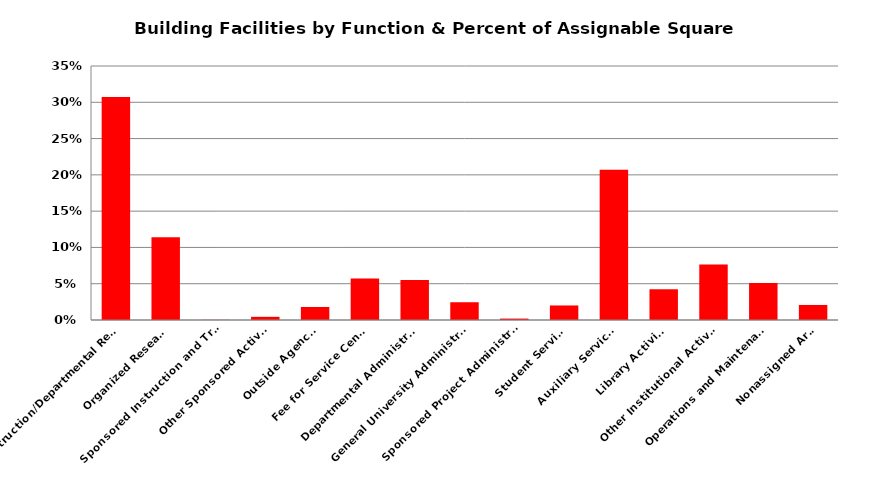
| Category | Percent |
|---|---|
| Instruction/Departmental Research | 0.307 |
| Organized Research | 0.114 |
| Sponsored Instruction and Training | 0 |
| Other Sponsored Activities | 0.004 |
| Outside Agencies | 0.018 |
| Fee for Service Centers | 0.057 |
| Departmental Administration | 0.055 |
| General University Administration | 0.024 |
| Sponsored Project Administration | 0.002 |
| Student Services | 0.02 |
| Auxiliary Services  | 0.207 |
| Library Activities | 0.042 |
| Other Institutional Activities  | 0.076 |
| Operations and Maintenance   | 0.051 |
| Nonassigned Areas | 0.021 |